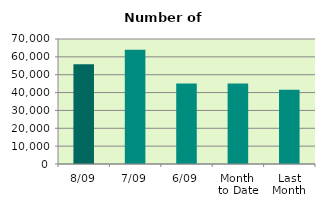
| Category | Series 0 |
|---|---|
| 8/09 | 55812 |
| 7/09 | 63990 |
| 6/09 | 45108 |
| Month 
to Date | 45088.667 |
| Last
Month | 41597.13 |